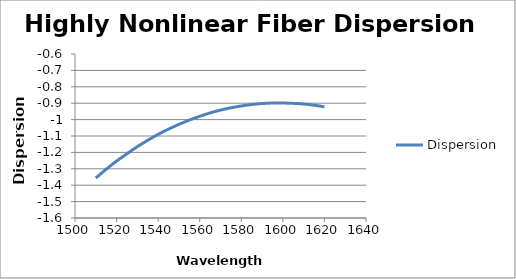
| Category | Dispersion |
|---|---|
| 1510.0 | -1.356 |
| 1515.0 | -1.303 |
| 1520.0 | -1.253 |
| 1525.0 | -1.208 |
| 1530.0 | -1.165 |
| 1535.0 | -1.126 |
| 1540.0 | -1.09 |
| 1545.0 | -1.058 |
| 1550.0 | -1.029 |
| 1555.0 | -1.003 |
| 1560.0 | -0.98 |
| 1565.0 | -0.959 |
| 1570.0 | -0.942 |
| 1575.0 | -0.928 |
| 1580.0 | -0.917 |
| 1585.0 | -0.908 |
| 1590.0 | -0.902 |
| 1595.0 | -0.899 |
| 1600.0 | -0.899 |
| 1605.0 | -0.901 |
| 1610.0 | -0.905 |
| 1615.0 | -0.912 |
| 1620.0 | -0.922 |